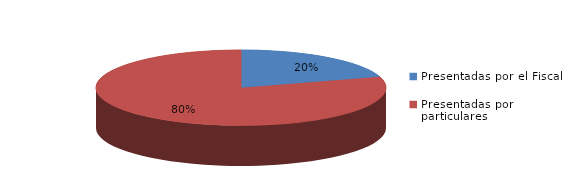
| Category | Series 0 |
|---|---|
| Presentadas por el Fiscal | 61 |
| Presentadas por particulares | 239 |